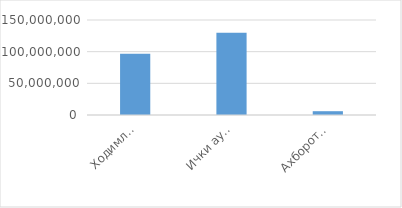
| Category | Товар / хизматнинг
жами суммаси
(cумда) 
(ҚҚС билан) |
|---|---|
| Ходимлар билан ишлаш бошқармаси | 96600000 |
| Ички аудит хизмати | 130000000 |
| Ахборот хавфсизлиги ва ахборот технологияларини ривожлантириш бошқармаси | 6000000 |